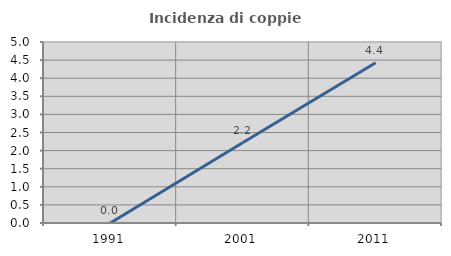
| Category | Incidenza di coppie miste |
|---|---|
| 1991.0 | 0 |
| 2001.0 | 2.222 |
| 2011.0 | 4.425 |